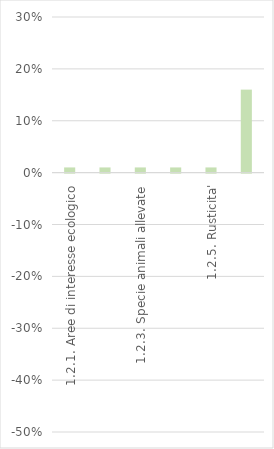
| Category | Series 0 |
|---|---|
| 1.2.1. Aree di interesse ecologico | 0.01 |
| 1.2.2. Biodiversita' animale | 0.01 |
| 1.2.3. Specie animali allevate | 0.01 |
| 1.2.4. Avvicendamento colturale | 0.01 |
| 1.2.5. Rusticita' | 0.01 |
| 1.2.6. Presenza di varieta'/razze, ecotipi vegetali e animali locali | 0.16 |